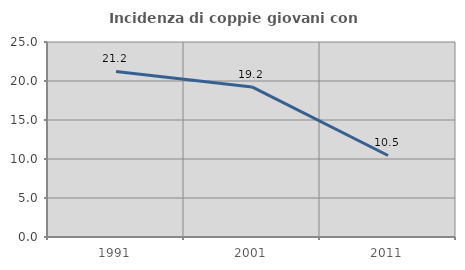
| Category | Incidenza di coppie giovani con figli |
|---|---|
| 1991.0 | 21.224 |
| 2001.0 | 19.242 |
| 2011.0 | 10.451 |